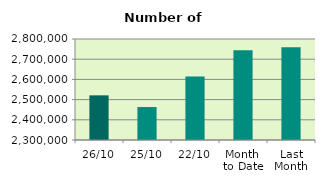
| Category | Series 0 |
|---|---|
| 26/10 | 2521042 |
| 25/10 | 2463192 |
| 22/10 | 2613930 |
| Month 
to Date | 2744822.556 |
| Last
Month | 2759252.364 |